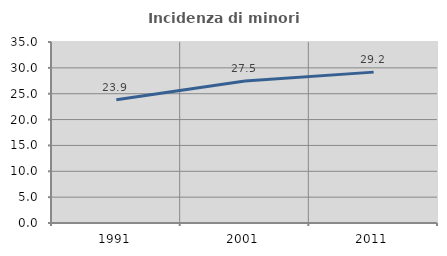
| Category | Incidenza di minori stranieri |
|---|---|
| 1991.0 | 23.853 |
| 2001.0 | 27.463 |
| 2011.0 | 29.175 |